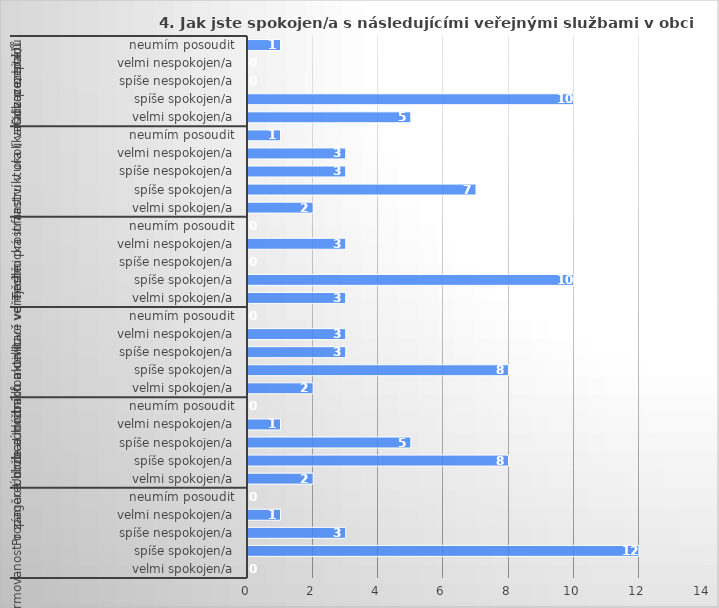
| Category | Series 0 |
|---|---|
| 0 | 0 |
| 1 | 12 |
| 2 | 3 |
| 3 | 1 |
| 4 | 0 |
| 5 | 2 |
| 6 | 8 |
| 7 | 5 |
| 8 | 1 |
| 9 | 0 |
| 10 | 2 |
| 11 | 8 |
| 12 | 3 |
| 13 | 3 |
| 14 | 0 |
| 15 | 3 |
| 16 | 10 |
| 17 | 0 |
| 18 | 3 |
| 19 | 0 |
| 20 | 2 |
| 21 | 7 |
| 22 | 3 |
| 23 | 3 |
| 24 | 1 |
| 25 | 5 |
| 26 | 10 |
| 27 | 0 |
| 28 | 0 |
| 29 | 1 |